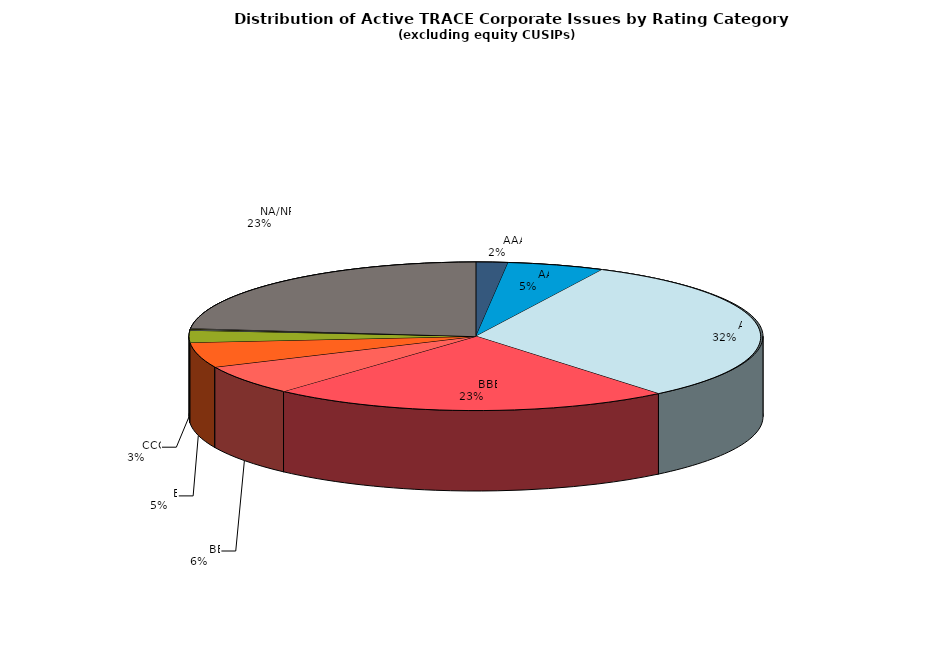
| Category | Series 0 |
|---|---|
|         AAA | 548 |
|         AA | 1674 |
|         A | 9723 |
|         BBB | 6934 |
|         BB | 1987 |
|         B | 1680 |
|         CCC | 799 |
|         CC | 61 |
|         C | 38 |
|         D | 40 |
|         NA/NR | 7115 |